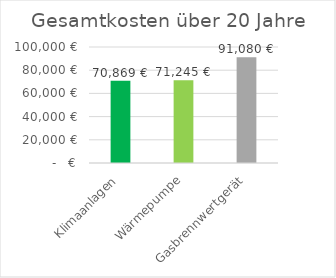
| Category | Series 0 |
|---|---|
| Klimaanlagen | 70869.335 |
| Wärmepumpe | 71244.709 |
| Gasbrennwertgerät | 91079.847 |